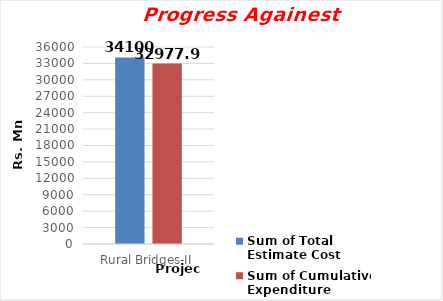
| Category | Sum of Total Estimate Cost  | Sum of Cumulative Expenditure |
|---|---|---|
| Rural Bridges-II | 34100 | 32977.92 |